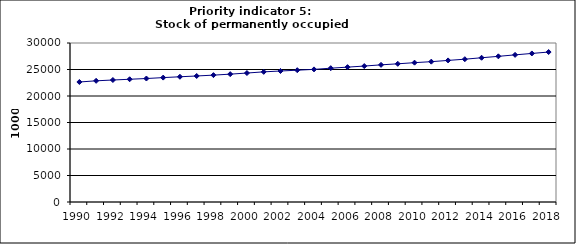
| Category | Stock of permanently occupied dwellings, 1000 |
|---|---|
| 1990 | 22643.922 |
| 1991 | 22862.734 |
| 1992 | 23016.502 |
| 1993 | 23159.711 |
| 1994 | 23298.46 |
| 1995 | 23470.105 |
| 1996 | 23627.609 |
| 1997 | 23777.987 |
| 1998 | 23937.522 |
| 1999 | 24122.857 |
| 2000 | 24333.192 |
| 2001 | 24557.508 |
| 2002 | 24714.518 |
| 2003 | 24867.87 |
| 2004 | 25022.034 |
| 2005 | 25249.505 |
| 2006 | 25445.964 |
| 2007 | 25650.572 |
| 2008 | 25875.694 |
| 2009 | 26075.474 |
| 2010 | 26288.643 |
| 2011 | 26477.045 |
| 2012 | 26714.454 |
| 2013 | 26944.184 |
| 2014 | 27214.168 |
| 2015 | 27484.27 |
| 2016 | 27761.889 |
| 2017 | 28029.823 |
| 2018 | 28294.751 |